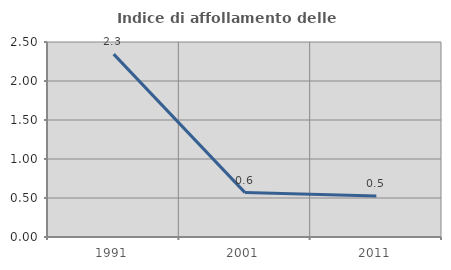
| Category | Indice di affollamento delle abitazioni  |
|---|---|
| 1991.0 | 2.344 |
| 2001.0 | 0.569 |
| 2011.0 | 0.525 |